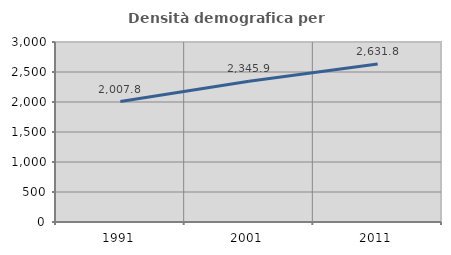
| Category | Densità demografica |
|---|---|
| 1991.0 | 2007.798 |
| 2001.0 | 2345.897 |
| 2011.0 | 2631.823 |